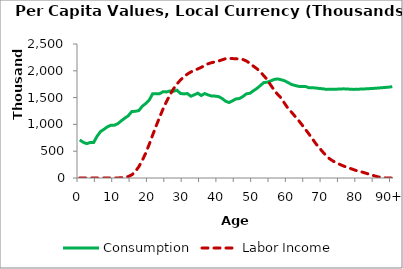
| Category | Consumption | Labor Income |
|---|---|---|
| 0 | 710222.18 | 0 |
|  | 666293.92 | 0 |
| 2 | 641485.07 | 0 |
| 3 | 662205.35 | 0 |
| 4 | 662991.27 | 0 |
| 5 | 779908.26 | 0 |
| 6 | 867191.6 | 0 |
| 7 | 908752.19 | 0 |
| 8 | 956197.82 | 0 |
| 9 | 985093.79 | 0 |
| 10 | 985837.28 | 0 |
| 11 | 1014972.3 | 0 |
| 12 | 1069598.6 | 5741.215 |
| 13 | 1117582.4 | 13098.806 |
| 14 | 1162317.2 | 28011.071 |
| 15 | 1240742.8 | 59460.917 |
| 16 | 1243967.5 | 119610.02 |
| 17 | 1257696.7 | 209505.65 |
| 18 | 1337680.2 | 326656.74 |
| 19 | 1389337 | 464246.04 |
| 20 | 1453275.6 | 626114.9 |
| 21 | 1571392 | 801079.14 |
| 22 | 1573752.3 | 971305.9 |
| 23 | 1572822.3 | 1134173 |
| 24 | 1609490.1 | 1290026.6 |
| 25 | 1606121.7 | 1426941.8 |
| 26 | 1624734.6 | 1553073.6 |
| 27 | 1618353.1 | 1663362.7 |
| 28 | 1637432.1 | 1752972.4 |
| 29 | 1577376 | 1828210.2 |
| 30 | 1568540.2 | 1886878.9 |
| 31 | 1574935.4 | 1938778.3 |
| 32 | 1525399.1 | 1978486.2 |
| 33 | 1552257.6 | 2008560.5 |
| 34 | 1582498.3 | 2035300.5 |
| 35 | 1538739.3 | 2064388.7 |
| 36 | 1575915.9 | 2099450.8 |
| 37 | 1548571.3 | 2132030.3 |
| 38 | 1528501.7 | 2152552.4 |
| 39 | 1527579 | 2166866.8 |
| 40 | 1518230.3 | 2183678.2 |
| 41 | 1483774.3 | 2203728.7 |
| 42 | 1432867.9 | 2226672.1 |
| 43 | 1407648.2 | 2232706.7 |
| 44 | 1440519.8 | 2228086.5 |
| 45 | 1475052.7 | 2223653.6 |
| 46 | 1482767.4 | 2219478.5 |
| 47 | 1520653.9 | 2209981.1 |
| 48 | 1570318.7 | 2183624.9 |
| 49 | 1580129.4 | 2137263.1 |
| 50 | 1627110.6 | 2087291.7 |
| 51 | 1670496 | 2039160.8 |
| 52 | 1724596.5 | 1982215.7 |
| 53 | 1780078 | 1907318.7 |
| 54 | 1787680.9 | 1836504.6 |
| 55 | 1811672.9 | 1732634.5 |
| 56 | 1839346.7 | 1640532.9 |
| 57 | 1848188.4 | 1558100.9 |
| 58 | 1833029.8 | 1492542.3 |
| 59 | 1813592.2 | 1392611 |
| 60 | 1780234.2 | 1297136.3 |
| 61 | 1744231.1 | 1227367.6 |
| 62 | 1726933.4 | 1150587.4 |
| 63 | 1709951.9 | 1075720.5 |
| 64 | 1706085.6 | 992323.52 |
| 65 | 1708182.1 | 906147.74 |
| 66 | 1682349.2 | 821628.34 |
| 67 | 1683239.9 | 729780.16 |
| 68 | 1679939.3 | 640217.32 |
| 69 | 1670261.4 | 561656.31 |
| 70 | 1664754.3 | 485484.72 |
| 71 | 1652892.8 | 414165.78 |
| 72 | 1656728.1 | 356824.73 |
| 73 | 1654264.4 | 313993.46 |
| 74 | 1656916.7 | 282443.86 |
| 75 | 1661531.7 | 250186.57 |
| 76 | 1663161.3 | 222955.81 |
| 77 | 1661311.5 | 197897.83 |
| 78 | 1655472.4 | 175944.33 |
| 79 | 1653077.3 | 153504.28 |
| 80 | 1655456.2 | 131083.68 |
| 81 | 1659549.5 | 116727.48 |
| 82 | 1661867.2 | 97732.637 |
| 83 | 1665236.1 | 77532.263 |
| 84 | 1669589.6 | 57368.044 |
| 85 | 1673688.1 | 37257.604 |
| 86 | 1678656.4 | 18803.687 |
| 87 | 1684334.7 | 15251.189 |
| 88 | 1689592.5 | 1832.58 |
| 89 | 1695165.2 | 0 |
| 90+ | 1705525.1 | 0 |